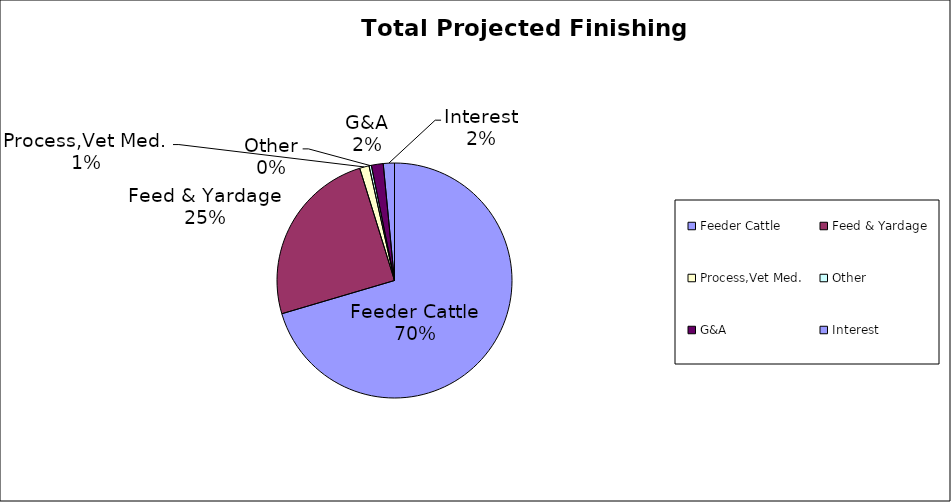
| Category | Total |
|---|---|
| Feeder Cattle | 108397.959 |
| Feed & Yardage | 38145.645 |
| Process,Vet Med. | 2000 |
| Other | 500 |
| G&A | 2500 |
| Interest | 2361.401 |